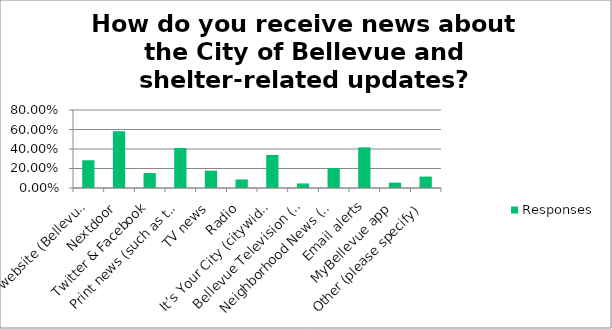
| Category | Responses |
|---|---|
| City website (BellevueWA.gov) | 0.285 |
| Nextdoor | 0.583 |
| Twitter & Facebook | 0.154 |
| Print news (such as the Bellevue Reporter) | 0.41 |
| TV news | 0.178 |
| Radio | 0.087 |
| It’s Your City (citywide newsletter) | 0.338 |
| Bellevue Television (cable channel 21) | 0.047 |
| Neighborhood News (monthly newsletter) | 0.204 |
| Email alerts | 0.417 |
| MyBellevue app | 0.055 |
| Other (please specify) | 0.117 |